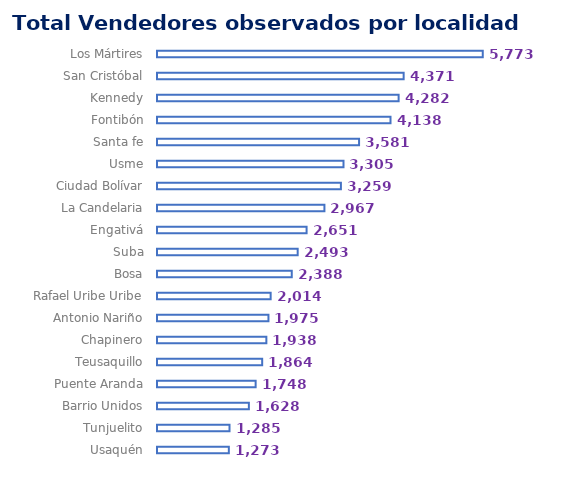
| Category | T Vendedores |
|---|---|
| Los Mártires | 5773 |
| San Cristóbal | 4371 |
| Kennedy | 4282 |
| Fontibón | 4138 |
| Santa fe | 3581 |
| Usme | 3305 |
| Ciudad Bolívar | 3259 |
| La Candelaria | 2967 |
| Engativá | 2651 |
| Suba | 2493 |
| Bosa | 2388 |
| Rafael Uribe Uribe | 2014 |
| Antonio Nariño | 1975 |
| Chapinero | 1938 |
| Teusaquillo | 1864 |
| Puente Aranda | 1748 |
| Barrio Unidos | 1628 |
| Tunjuelito | 1285 |
| Usaquén | 1273 |